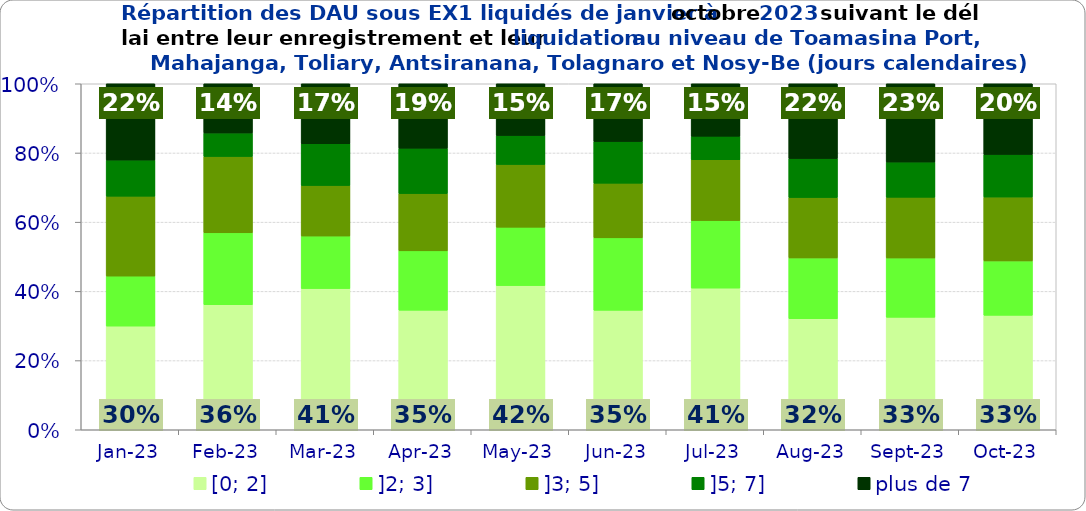
| Category | [0; 2] | ]2; 3] | ]3; 5] | ]5; 7] | plus de 7 |
|---|---|---|---|---|---|
| 2023-01-01 | 0.3 | 0.145 | 0.231 | 0.104 | 0.221 |
| 2023-02-01 | 0.362 | 0.208 | 0.221 | 0.068 | 0.142 |
| 2023-03-01 | 0.408 | 0.152 | 0.146 | 0.121 | 0.173 |
| 2023-04-01 | 0.345 | 0.172 | 0.165 | 0.131 | 0.186 |
| 2023-05-01 | 0.417 | 0.169 | 0.181 | 0.084 | 0.149 |
| 2023-06-01 | 0.345 | 0.209 | 0.158 | 0.12 | 0.167 |
| 2023-07-01 | 0.409 | 0.195 | 0.176 | 0.068 | 0.152 |
| 2023-08-01 | 0.321 | 0.176 | 0.175 | 0.113 | 0.216 |
| 2023-09-01 | 0.325 | 0.171 | 0.175 | 0.102 | 0.226 |
| 2023-10-01 | 0.331 | 0.157 | 0.184 | 0.123 | 0.204 |